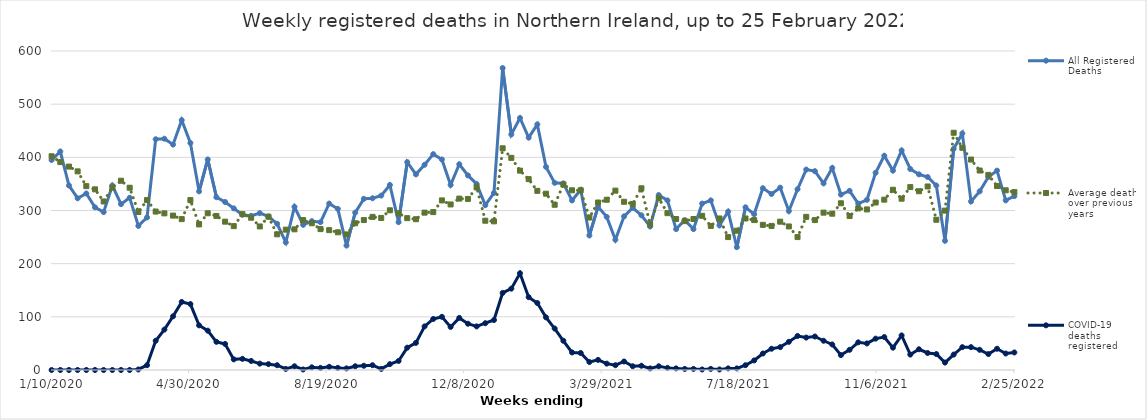
| Category | All Registered Deaths | Average deaths over previous 5 years | COVID-19 deaths registered |
|---|---|---|---|
| 1/10/20 | 395 | 402 | 0 |
| 1/17/20 | 411 | 391 | 0 |
| 1/24/20 | 347 | 382.6 | 0 |
| 1/31/20 | 323 | 373.6 | 0 |
| 2/7/20 | 332 | 345.8 | 0 |
| 2/14/20 | 306 | 339.8 | 0 |
| 2/21/20 | 297 | 317 | 0 |
| 2/28/20 | 347 | 343 | 0 |
| 3/6/20 | 312 | 356 | 0 |
| 3/13/20 | 324 | 342.8 | 0 |
| 3/20/20 | 271 | 297.2 | 1 |
| 3/27/20 | 287 | 319.6 | 9 |
| 4/3/20 | 434 | 298 | 55 |
| 4/10/20 | 435 | 294.6 | 76 |
| 4/17/20 | 424 | 290.4 | 101 |
| 4/24/20 | 470 | 283.8 | 128 |
| 5/1/20 | 427 | 319.6 | 124 |
| 5/8/20 | 336 | 273.8 | 84 |
| 5/15/20 | 396 | 294.8 | 74 |
| 5/22/20 | 325 | 289.8 | 53 |
| 5/29/20 | 316 | 279 | 49 |
| 6/5/20 | 304 | 270.6 | 20 |
| 6/12/20 | 292 | 293.2 | 21 |
| 6/19/20 | 290 | 286.4 | 17 |
| 6/26/20 | 295 | 270 | 12 |
| 7/3/20 | 289 | 288.2 | 11 |
| 7/10/20 | 275 | 255.2 | 9 |
| 7/17/20 | 240 | 264 | 2 |
| 7/24/20 | 307 | 264.6 | 7 |
| 7/31/20 | 273 | 282 | 1 |
| 8/7/20 | 280 | 276 | 5 |
| 8/14/20 | 278 | 265 | 4 |
| 8/21/20 | 313 | 263 | 6 |
| 8/28/20 | 303 | 259 | 4 |
| 9/4/20 | 234 | 255 | 3 |
| 9/11/20 | 296 | 276 | 7 |
| 9/18/20 | 322 | 282 | 8 |
| 9/25/20 | 323 | 288 | 9 |
| 10/2/20 | 328 | 286 | 2 |
| 10/9/20 | 348 | 300.4 | 11 |
| 10/16/20 | 278 | 294.8 | 17 |
| 10/23/20 | 391 | 285.6 | 42 |
| 10/30/20 | 368 | 283.6 | 51 |
| 11/6/20 | 386 | 296 | 82 |
| 11/13/20 | 406 | 297 | 96 |
| 11/20/20 | 396 | 319 | 100 |
| 11/27/20 | 348 | 311.4 | 81 |
| 12/4/20 | 387 | 322.4 | 98 |
| 12/11/20 | 366 | 321.8 | 87 |
| 12/18/20 | 350 | 343.8 | 82 |
| 12/25/20 | 310 | 280.8 | 88 |
| 1/1/21 | 333 | 279.6 | 94 |
| 1/8/21 | 568 | 417 | 145 |
| 1/15/21 | 443 | 399 | 153 |
| 1/22/21 | 474 | 375 | 182 |
| 1/29/21 | 437 | 359 | 137 |
| 2/5/21 | 462 | 337 | 126 |
| 2/12/21 | 382 | 331.6 | 99 |
| 2/19/21 | 352 | 310.8 | 78 |
| 2/26/21 | 351 | 349 | 55 |
| 3/5/21 | 319 | 338 | 33 |
| 3/12/21 | 339 | 338 | 32 |
| 3/19/21 | 253 | 286.8 | 15 |
| 3/26/21 | 307 | 315 | 19 |
| 4/2/21 | 288 | 320.2 | 12 |
| 4/9/21 | 245 | 337.4 | 9 |
| 4/16/21 | 289 | 316.4 | 16 |
| 4/23/21 | 305 | 312.4 | 7 |
| 4/30/21 | 291 | 341.8 | 8 |
| 5/7/21 | 270 | 274 | 3 |
| 5/14/21 | 329 | 323 | 7 |
| 5/21/21 | 319 | 295 | 4 |
| 5/28/21 | 265 | 284 | 3 |
| 6/4/21 | 282 | 280 | 2 |
| 6/11/21 | 265 | 284 | 2 |
| 6/18/21 | 313 | 290 | 1 |
| 6/25/21 | 319 | 271 | 2 |
| 7/2/21 | 272 | 285 | 1 |
| 7/9/21 | 298 | 250 | 3 |
| 7/16/21 | 231 | 262 | 3 |
| 7/23/21 | 306 | 285 | 9 |
| 7/30/21 | 293 | 282 | 18 |
| 8/6/21 | 342 | 273 | 31 |
| 8/13/21 | 331 | 271 | 40 |
| 8/20/21 | 343 | 279 | 43 |
| 8/27/21 | 299 | 270 | 53 |
| 9/3/21 | 340 | 250 | 64 |
| 9/10/21 | 377 | 288 | 61 |
| 9/17/21 | 374 | 282 | 63 |
| 9/24/21 | 351 | 296 | 55 |
| 10/1/21 | 380 | 294 | 48 |
| 10/8/21 | 330 | 313.6 | 28 |
| 10/15/21 | 337 | 289.6 | 38 |
| 10/22/21 | 313 | 304 | 52 |
| 10/29/21 | 320 | 302 | 50 |
| 11/5/21 | 371 | 315 | 59 |
| 11/12/21 | 403 | 320.4 | 62 |
| 11/19/21 | 375 | 339 | 42 |
| 11/26/21 | 413 | 322.2 | 65 |
| 12/3/21 | 378 | 344 | 29 |
| 12/10/21 | 368 | 336.2 | 39 |
| 12/17/21 | 363 | 345.2 | 32 |
| 12/24/21 | 347 | 282.6 | 30 |
| 12/31/21 | 243 | 299.8 | 14 |
| 1/7/22 | 416 | 446.2 | 29 |
| 1/14/22 | 445 | 418 | 43 |
| 1/21/22 | 317 | 395.8 | 43 |
| 1/28/22 | 336 | 375.2 | 38 |
| 2/4/22 | 363 | 367 | 30 |
| 2/11/22 | 375 | 346 | 40 |
| 2/18/22 | 319 | 338 | 31 |
| 2/25/22 | 327 | 334.6 | 33 |